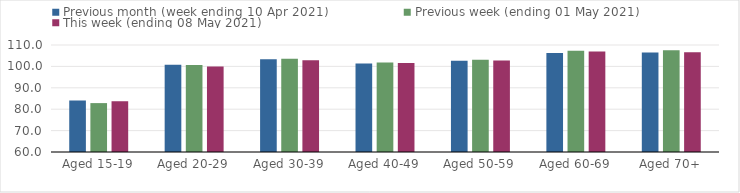
| Category | Previous month (week ending 10 Apr 2021) | Previous week (ending 01 May 2021) | This week (ending 08 May 2021) |
|---|---|---|---|
| Aged 15-19 | 84.09 | 82.85 | 83.72 |
| Aged 20-29 | 100.73 | 100.63 | 99.91 |
| Aged 30-39 | 103.33 | 103.54 | 102.91 |
| Aged 40-49 | 101.39 | 101.82 | 101.59 |
| Aged 50-59 | 102.61 | 103.06 | 102.8 |
| Aged 60-69 | 106.26 | 107.26 | 106.92 |
| Aged 70+ | 106.47 | 107.54 | 106.65 |